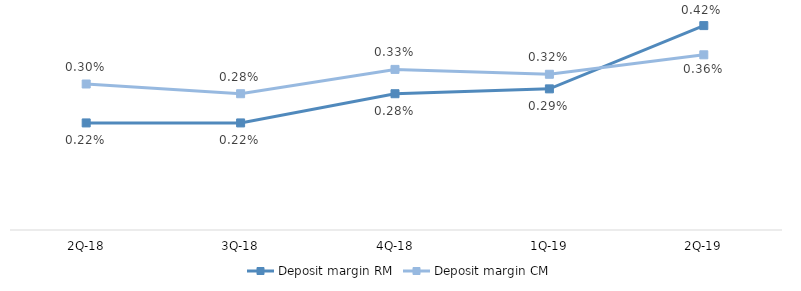
| Category | Deposit margin RM | Deposit margin CM |
|---|---|---|
| 2Q-19 | 0.004 | 0.004 |
| 1Q-19 | 0.003 | 0.003 |
| 4Q-18 | 0.003 | 0.003 |
| 3Q-18 | 0.002 | 0.003 |
| 2Q-18 | 0.002 | 0.003 |